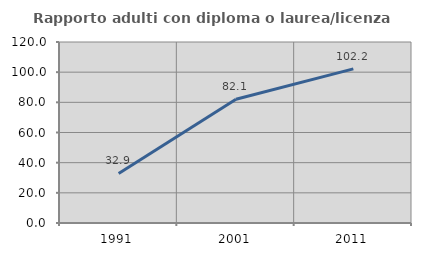
| Category | Rapporto adulti con diploma o laurea/licenza media  |
|---|---|
| 1991.0 | 32.867 |
| 2001.0 | 82.081 |
| 2011.0 | 102.212 |